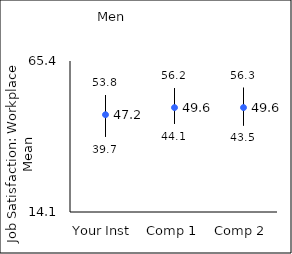
| Category | 25th percentile | 75th percentile | Mean |
|---|---|---|---|
| Your Inst | 39.7 | 53.8 | 47.15 |
| Comp 1 | 44.1 | 56.2 | 49.57 |
| Comp 2 | 43.5 | 56.3 | 49.58 |